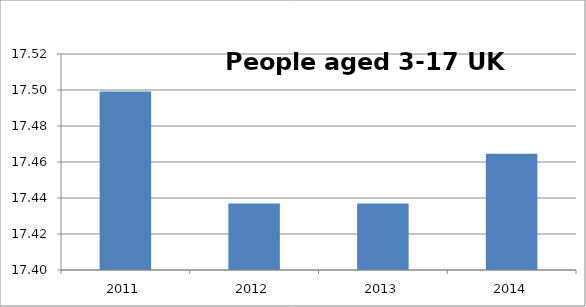
| Category | Series 0 |
|---|---|
| 2011 | 17.499 |
| 2012 | 17.437 |
| 2013 | 17.437 |
| 2014 | 17.465 |